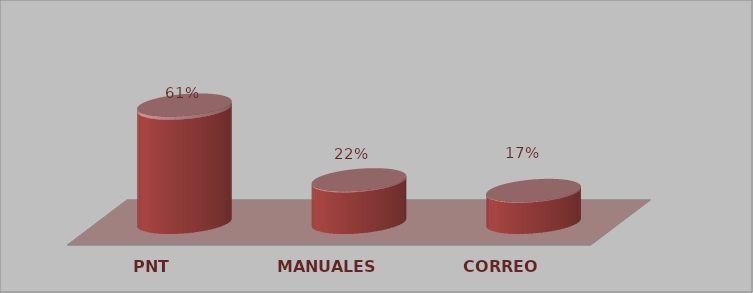
| Category | Series 0 | Series 1 |
|---|---|---|
| PNT | 22 | 0.611 |
| MANUALES | 8 | 0.222 |
| CORREO | 6 | 0.167 |